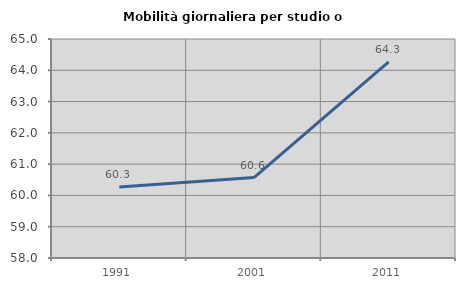
| Category | Mobilità giornaliera per studio o lavoro |
|---|---|
| 1991.0 | 60.268 |
| 2001.0 | 60.57 |
| 2011.0 | 64.267 |